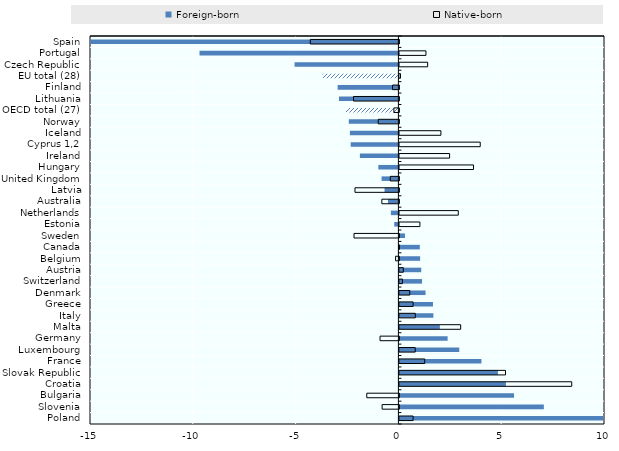
| Category | Foreign-born | Native-born |
|---|---|---|
| Spain | -19.786 | -4.309 |
| Portugal | -9.673 | 1.291 |
| Czech Republic | -5.05 | 1.375 |
| EU total (28) | -3.686 | 0.054 |
| Finland | -2.954 | -0.308 |
| Lithuania | -2.891 | -2.208 |
| OECD total (27) | -2.548 | -0.244 |
| Norway | -2.413 | -1.005 |
| Iceland | -2.358 | 2.019 |
| Cyprus 1,2 | -2.32 | 3.931 |
| Ireland | -1.873 | 2.442 |
| Hungary | -0.976 | 3.606 |
| United Kingdom | -0.819 | -0.42 |
| Latvia | -0.673 | -2.136 |
| Australia | -0.507 | -0.829 |
| Netherlands | -0.367 | 2.865 |
| Estonia | -0.202 | 0.997 |
| Sweden | 0.271 | -2.184 |
| Canada | 0.992 | -0.003 |
| Belgium | 1.008 | -0.161 |
| Austria | 1.061 | 0.192 |
| Switzerland | 1.101 | 0.148 |
| Denmark | 1.271 | 0.505 |
| Greece | 1.633 | 0.665 |
| Italy | 1.653 | 0.775 |
| Malta | 1.969 | 2.981 |
| Germany | 2.346 | -0.918 |
| Luxembourg | 2.912 | 0.769 |
| France | 3.99 | 1.232 |
| Slovak Republic | 4.792 | 5.161 |
| Croatia | 5.179 | 8.382 |
| Bulgaria | 5.576 | -1.562 |
| Slovenia | 7.025 | -0.816 |
| Poland | 9.914 | 0.666 |